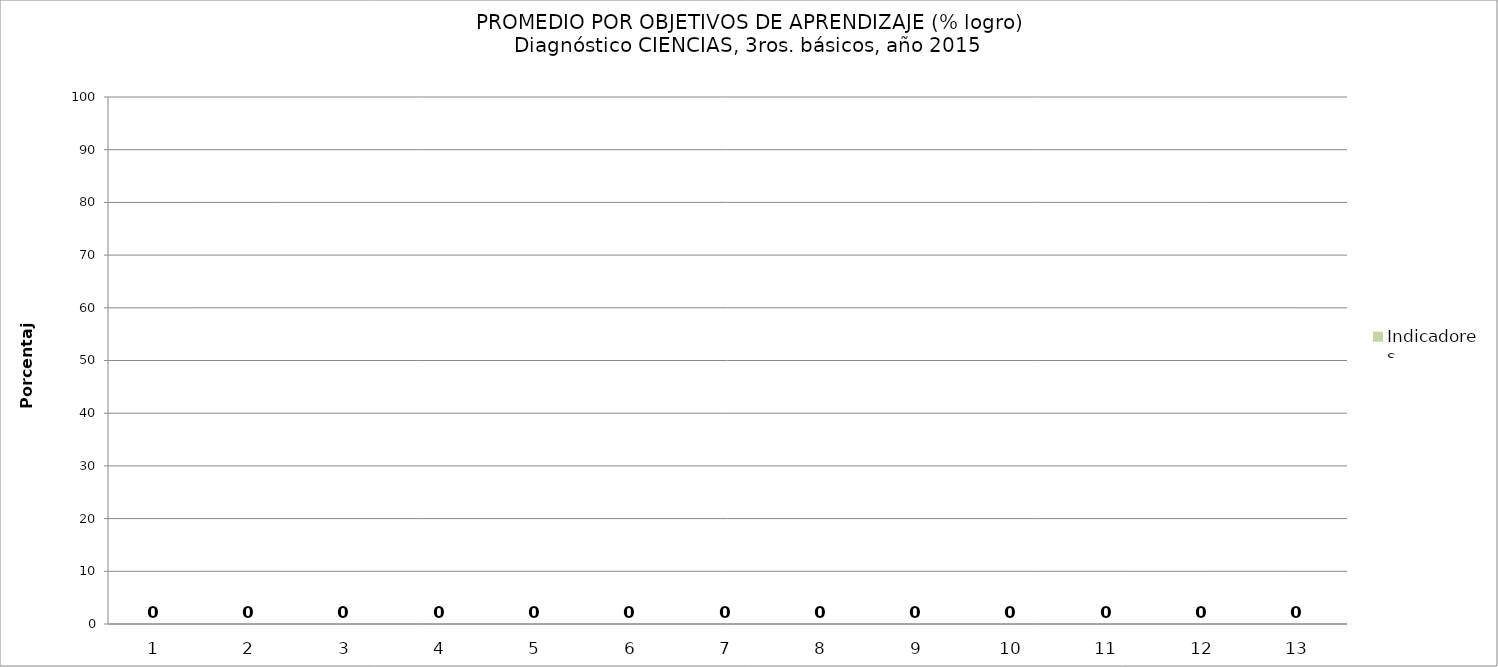
| Category | Indicadores |
|---|---|
| 0 | 0 |
| 1 | 0 |
| 2 | 0 |
| 3 | 0 |
| 4 | 0 |
| 5 | 0 |
| 6 | 0 |
| 7 | 0 |
| 8 | 0 |
| 9 | 0 |
| 10 | 0 |
| 11 | 0 |
| 12 | 0 |